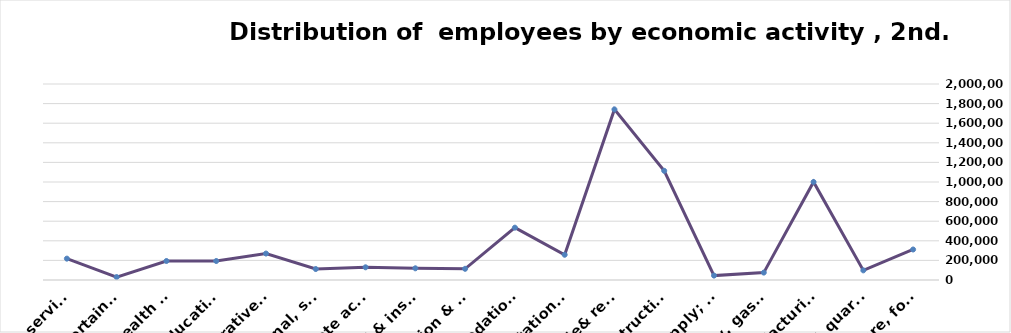
| Category | Series 0 |
|---|---|
| Agriculture, forestry & fishing | 311314 |
| Mining & quarrying | 98304 |
| Manufacturing | 1000527 |
| Electricity, gas, steam & air conditioning supply | 75531 |
| Water supply; sewerage, waste remediation  | 45026 |
| Construction | 1113891 |
| Wholesale& retail trade; repair of motor vehicles | 1740699 |
| Transportation& storage | 257459 |
| Accommodation & food service activities | 533968 |
| Information & communication | 114251 |
| Financial & insurance | 119265 |
| Real estate activities | 129559 |
| Professional, scientific & technical activities | 111985 |
| Administrative and support service activities | 269865 |
| Education | 193665 |
| Human health and &l work activities | 193835 |
| Arts, entertainment & recreation | 29998 |
| Other service | 217918 |